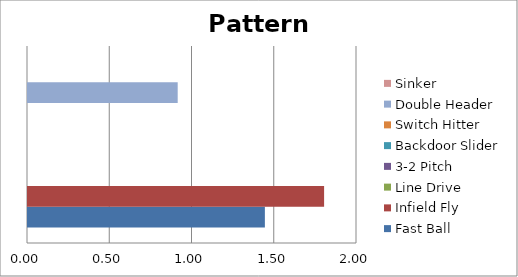
| Category | Fast Ball | Infield Fly | Line Drive | 3-2 Pitch | Backdoor Slider | Switch Hitter | Double Header | Sinker |
|---|---|---|---|---|---|---|---|---|
| 0 | 1.44 | 1.8 | 0 | 0 | 0 | 0 | 0.91 | 0 |